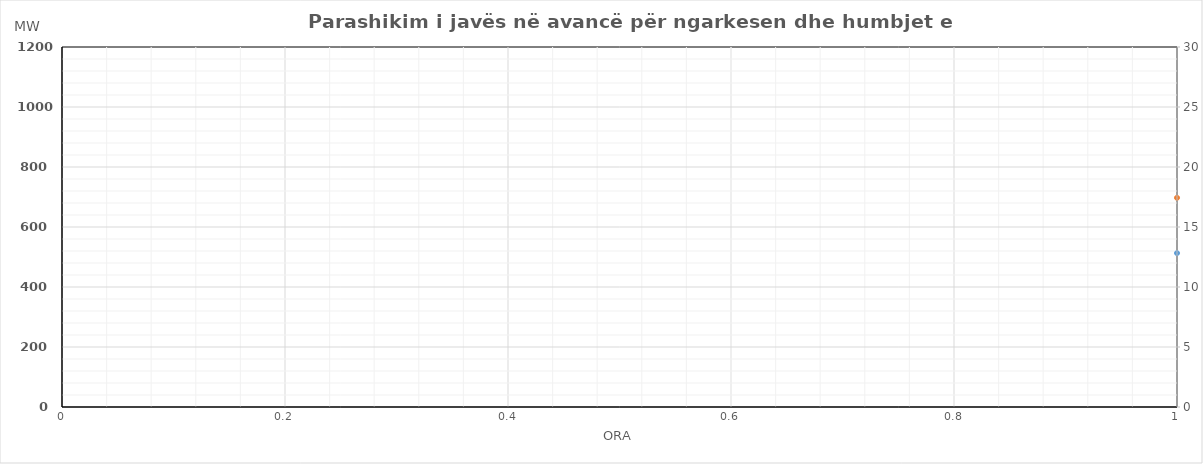
| Category | Ngarkesa (MWh) |
|---|---|
| 0 | 697.319 |
| 1 | 637.036 |
| 2 | 593.046 |
| 3 | 573.716 |
| 4 | 573.12 |
| 5 | 602.876 |
| 6 | 683.859 |
| 7 | 801.588 |
| 8 | 921.967 |
| 9 | 970.146 |
| 10 | 998.241 |
| 11 | 1052.468 |
| 12 | 1077.182 |
| 13 | 1077.155 |
| 14 | 1058.572 |
| 15 | 1027.125 |
| 16 | 1024.867 |
| 17 | 1043.563 |
| 18 | 1062.459 |
| 19 | 1063.575 |
| 20 | 1095.487 |
| 21 | 1035.673 |
| 22 | 925.778 |
| 23 | 805.227 |
| 24 | 712.151 |
| 25 | 638.193 |
| 26 | 618.917 |
| 27 | 592.677 |
| 28 | 603.714 |
| 29 | 648.799 |
| 30 | 741.279 |
| 31 | 866.978 |
| 32 | 953.699 |
| 33 | 1001.772 |
| 34 | 1027.062 |
| 35 | 1057.675 |
| 36 | 1056.378 |
| 37 | 1071.721 |
| 38 | 1059.329 |
| 39 | 1037.241 |
| 40 | 1019.075 |
| 41 | 1023.681 |
| 42 | 1040.565 |
| 43 | 1041.687 |
| 44 | 1074.293 |
| 45 | 1028.161 |
| 46 | 926.267 |
| 47 | 807.126 |
| 48 | 688.474 |
| 49 | 628.464 |
| 50 | 590.018 |
| 51 | 571.471 |
| 52 | 571.437 |
| 53 | 600.466 |
| 54 | 682.325 |
| 55 | 807.991 |
| 56 | 912.089 |
| 57 | 968.316 |
| 58 | 999.495 |
| 59 | 1030.945 |
| 60 | 1048.931 |
| 61 | 1059.896 |
| 62 | 1041.81 |
| 63 | 1013.817 |
| 64 | 1010.413 |
| 65 | 1016.766 |
| 66 | 1043.212 |
| 67 | 1052.737 |
| 68 | 1093.546 |
| 69 | 1033.042 |
| 70 | 918.41 |
| 71 | 802.843 |
| 72 | 722.891 |
| 73 | 657.787 |
| 74 | 607.181 |
| 75 | 592.689 |
| 76 | 605.164 |
| 77 | 604.873 |
| 78 | 698.883 |
| 79 | 853.633 |
| 80 | 959.229 |
| 81 | 1009.278 |
| 82 | 1046.77 |
| 83 | 1068.838 |
| 84 | 1074.916 |
| 85 | 1088.371 |
| 86 | 1074.172 |
| 87 | 1046.831 |
| 88 | 1039.358 |
| 89 | 1051.514 |
| 90 | 1067.143 |
| 91 | 1069.365 |
| 92 | 1099.661 |
| 93 | 1052.409 |
| 94 | 930.284 |
| 95 | 811.899 |
| 96 | 705.614 |
| 97 | 654.316 |
| 98 | 618.082 |
| 99 | 597.61 |
| 100 | 594.354 |
| 101 | 614.239 |
| 102 | 681.191 |
| 103 | 770.299 |
| 104 | 847.108 |
| 105 | 903.43 |
| 106 | 939.296 |
| 107 | 972.379 |
| 108 | 1002.801 |
| 109 | 1004.188 |
| 110 | 977.668 |
| 111 | 961.311 |
| 112 | 968.489 |
| 113 | 992.128 |
| 114 | 1022.769 |
| 115 | 1038.337 |
| 116 | 1090.941 |
| 117 | 1034.142 |
| 118 | 942.61 |
| 119 | 829.691 |
| 120 | 695.524 |
| 121 | 631.638 |
| 122 | 596.036 |
| 123 | 574.49 |
| 124 | 568.58 |
| 125 | 595.211 |
| 126 | 673.776 |
| 127 | 807.548 |
| 128 | 920.212 |
| 129 | 973.829 |
| 130 | 1001.78 |
| 131 | 1023.759 |
| 132 | 1058.411 |
| 133 | 1069.126 |
| 134 | 1010.42 |
| 135 | 953.324 |
| 136 | 946.622 |
| 137 | 970.01 |
| 138 | 996.302 |
| 139 | 1009.474 |
| 140 | 1043.427 |
| 141 | 983.649 |
| 142 | 883.611 |
| 143 | 760.949 |
| 144 | 698.364 |
| 145 | 631.236 |
| 146 | 597.016 |
| 147 | 576.388 |
| 148 | 573.35 |
| 149 | 593.998 |
| 150 | 685.865 |
| 151 | 827.406 |
| 152 | 950.96 |
| 153 | 1014.526 |
| 154 | 1042.008 |
| 155 | 1069.759 |
| 156 | 1090.722 |
| 157 | 1096.951 |
| 158 | 1079.434 |
| 159 | 1056.774 |
| 160 | 1048.104 |
| 161 | 1039.684 |
| 162 | 1051.614 |
| 163 | 1060.79 |
| 164 | 1100.511 |
| 165 | 1042.673 |
| 166 | 938.67 |
| 167 | 814.372 |